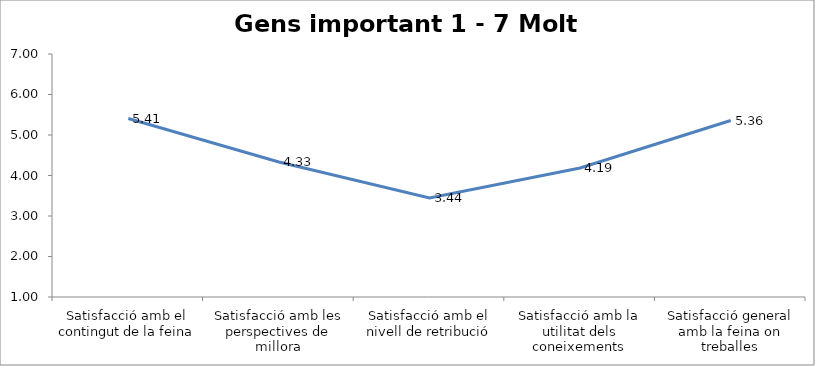
| Category | ARQUITECTURA |
|---|---|
| Satisfacció amb el contingut de la feina | 5.407 |
| Satisfacció amb les perspectives de millora | 4.333 |
| Satisfacció amb el nivell de retribució | 3.444 |
| Satisfacció amb la utilitat dels coneixements | 4.185 |
| Satisfacció general amb la feina on treballes | 5.357 |